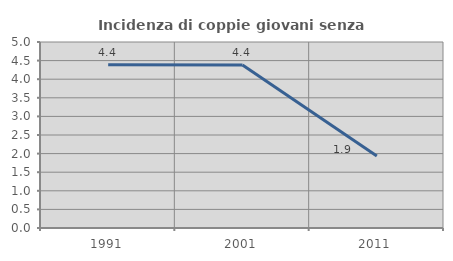
| Category | Incidenza di coppie giovani senza figli |
|---|---|
| 1991.0 | 4.386 |
| 2001.0 | 4.379 |
| 2011.0 | 1.932 |